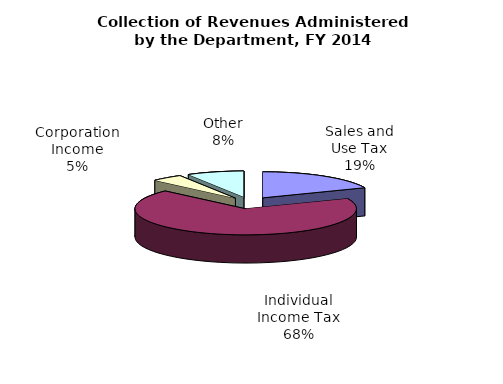
| Category | Series 0 |
|---|---|
| Sales and Use Tax | 3066456000 |
| Individual Income Tax | 11253348000 |
| Corporation Income | 757491000 |
| Other | 1374899000 |